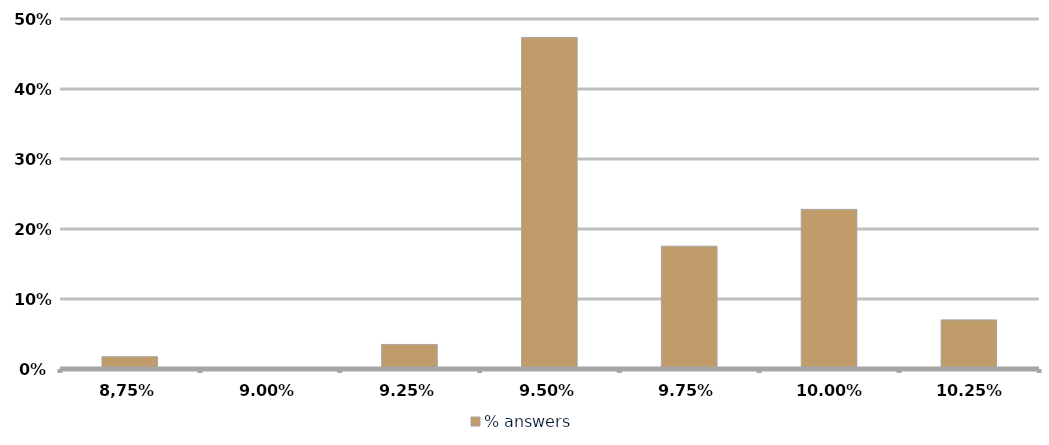
| Category | % answers |
|---|---|
| 8,75% | 0.018 |
| 9,00% | 0 |
| 9,25% | 0.035 |
| 9,50% | 0.474 |
| 9,75% | 0.175 |
| 10,00% | 0.228 |
| 10,25% | 0.07 |